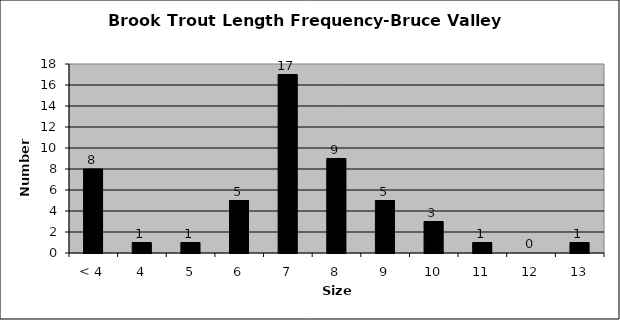
| Category | Series 0 |
|---|---|
| < 4 | 8 |
| 4 | 1 |
| 5 | 1 |
| 6 | 5 |
| 7 | 17 |
| 8 | 9 |
| 9 | 5 |
| 10 | 3 |
| 11 | 1 |
| 12 | 0 |
| 13 | 1 |